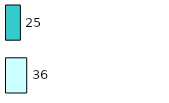
| Category | Series 0 | Series 1 |
|---|---|---|
| 0 | 36 | 25 |